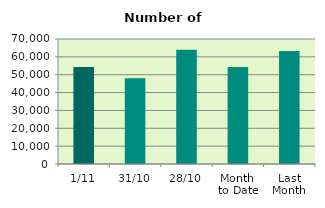
| Category | Series 0 |
|---|---|
| 1/11 | 54268 |
| 31/10 | 47988 |
| 28/10 | 63974 |
| Month 
to Date | 54268 |
| Last
Month | 63348.667 |